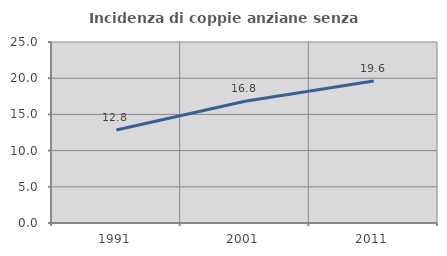
| Category | Incidenza di coppie anziane senza figli  |
|---|---|
| 1991.0 | 12.85 |
| 2001.0 | 16.821 |
| 2011.0 | 19.613 |